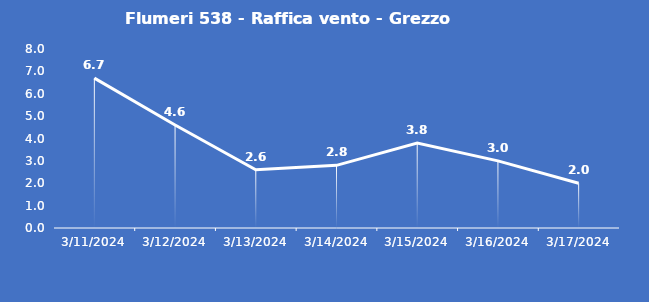
| Category | Flumeri 538 - Raffica vento - Grezzo (m/s) |
|---|---|
| 3/11/24 | 6.7 |
| 3/12/24 | 4.6 |
| 3/13/24 | 2.6 |
| 3/14/24 | 2.8 |
| 3/15/24 | 3.8 |
| 3/16/24 | 3 |
| 3/17/24 | 2 |